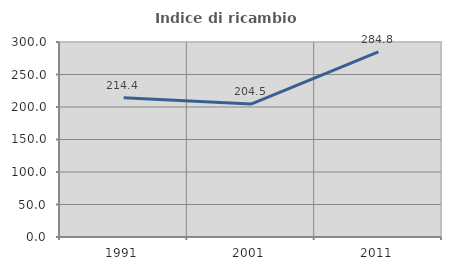
| Category | Indice di ricambio occupazionale  |
|---|---|
| 1991.0 | 214.394 |
| 2001.0 | 204.505 |
| 2011.0 | 284.821 |